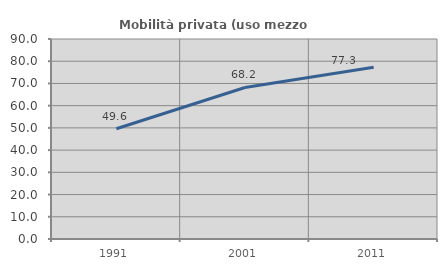
| Category | Mobilità privata (uso mezzo privato) |
|---|---|
| 1991.0 | 49.59 |
| 2001.0 | 68.182 |
| 2011.0 | 77.328 |